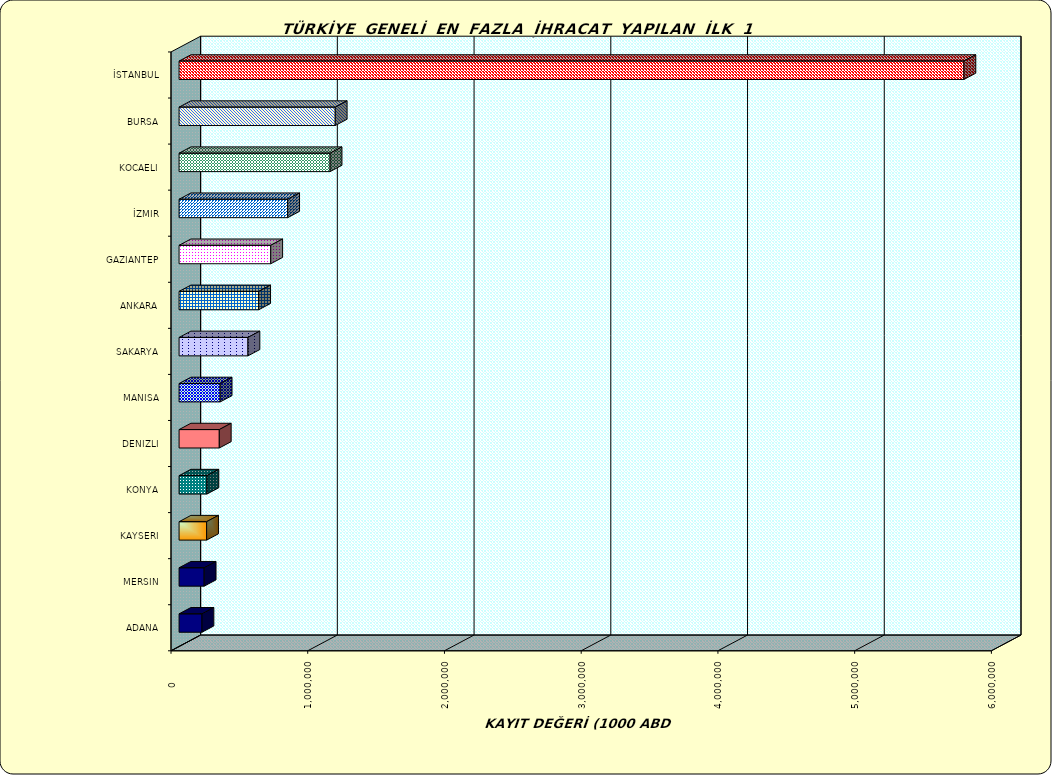
| Category | Series 0 |
|---|---|
| İSTANBUL | 5740058.903 |
| BURSA | 1142278.712 |
| KOCAELI | 1104470.687 |
| İZMIR | 794354.524 |
| GAZIANTEP | 670510.849 |
| ANKARA | 582297.831 |
| SAKARYA | 503810.919 |
| MANISA | 300490.687 |
| DENIZLI | 294037.537 |
| KONYA | 203695.466 |
| KAYSERI | 201365.206 |
| MERSIN | 183547.102 |
| ADANA | 167543.261 |